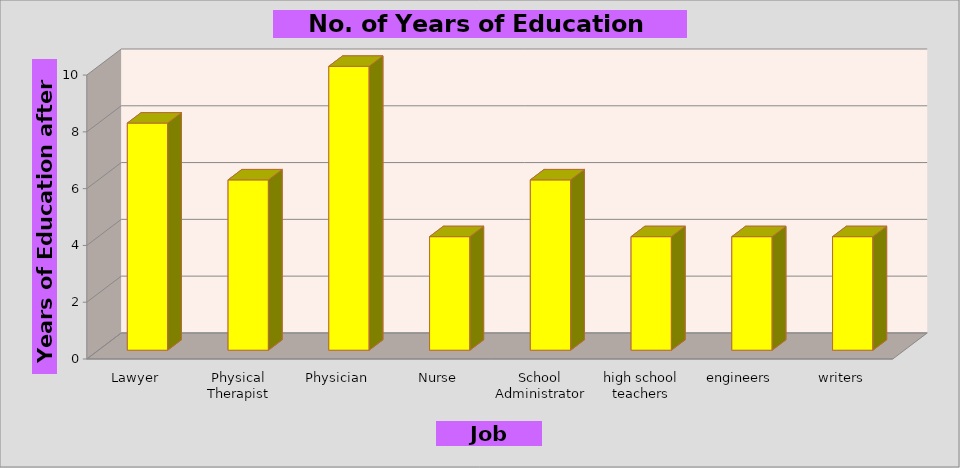
| Category | Series 0 |
|---|---|
| Lawyer | 8 |
| Physical Therapist | 6 |
| Physician | 10 |
| Nurse | 4 |
| School Administrator | 6 |
| high school teachers | 4 |
| engineers | 4 |
| writers | 4 |